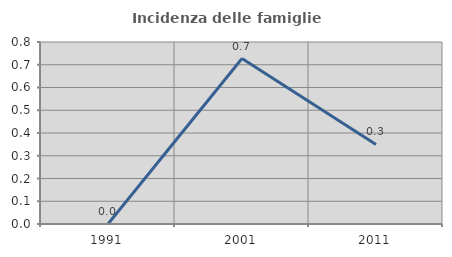
| Category | Incidenza delle famiglie numerose |
|---|---|
| 1991.0 | 0 |
| 2001.0 | 0.727 |
| 2011.0 | 0.35 |